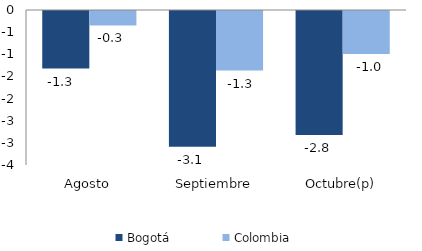
| Category | Bogotá | Colombia |
|---|---|---|
| Agosto | -1.3 | -0.327 |
| Septiembre | -3.066 | -1.344 |
| Octubre(p) | -2.8 | -0.969 |